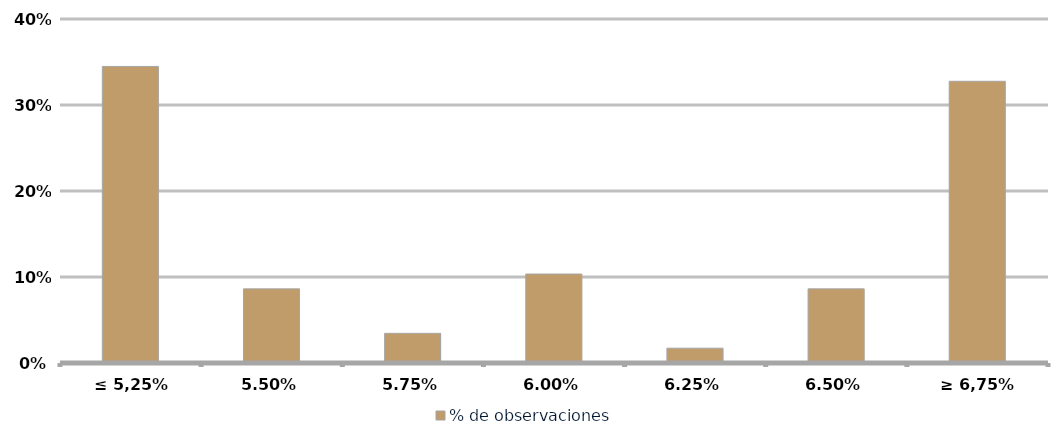
| Category | % de observaciones  |
|---|---|
| ≤ 5,25% | 0.345 |
| 5,50% | 0.086 |
| 5,75% | 0.034 |
| 6,00% | 0.103 |
| 6,25% | 0.017 |
| 6,50% | 0.086 |
| ≥ 6,75% | 0.328 |